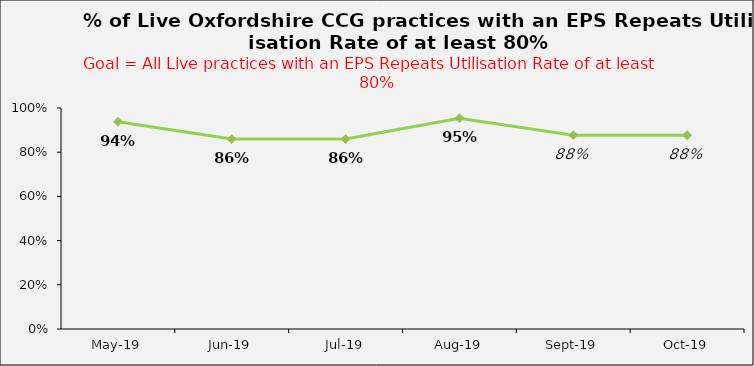
| Category | Series 0 |
|---|---|
| 2019-05-01 | 0.938 |
| 2019-06-01 | 0.859 |
| 2019-07-01 | 0.859 |
| 2019-08-01 | 0.954 |
| 2019-09-01 | 0.877 |
| 2019-10-01 | 0.877 |